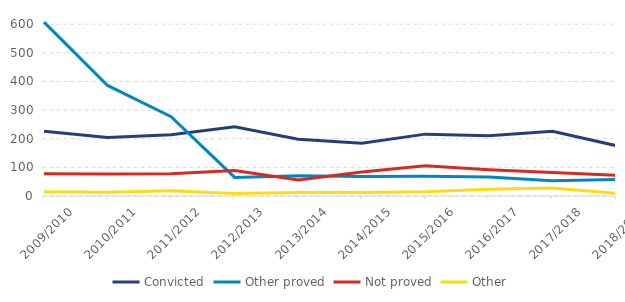
| Category | Convicted | Other proved | Not proved | Other |
|---|---|---|---|---|
| 2009/2010 | 226 | 607 | 78 | 15 |
| 2010/2011 | 204 | 386 | 77 | 13 |
| 2011/2012 | 214 | 277 | 78 | 18 |
| 2012/2013 | 242 | 65 | 89 | 9 |
| 2013/2014 | 198 | 71 | 56 | 12 |
| 2014/2015 | 184 | 68 | 84 | 12 |
| 2015/2016 | 216 | 69 | 106 | 15 |
| 2016/2017 | 210 | 66 | 92 | 24 |
| 2017/2018 | 226 | 53 | 82 | 28 |
| 2018/2019 | 176 | 58 | 72 | 9 |